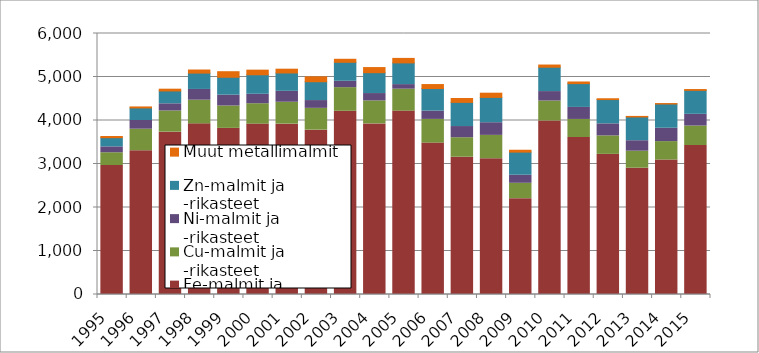
| Category | Fe-malmit ja -rikasteet | Cu-malmit ja -rikasteet | Ni-malmit ja -rikasteet | Zn-malmit ja -rikasteet | Muut metallimalmit |
|---|---|---|---|---|---|
| 1995.0 | 2964991 | 293676 | 134831 | 211074 | 27802 |
| 1996.0 | 3305768 | 494217 | 200610 | 288603 | 22806 |
| 1997.0 | 3732023 | 487477 | 163962 | 295485 | 40700 |
| 1998.0 | 3922531 | 544111 | 247276 | 375432 | 71235 |
| 1999.0 | 3818566 | 514879 | 249028 | 411447 | 127706 |
| 2000.0 | 3917135 | 468557 | 217154 | 448698 | 105879 |
| 2001.0 | 3916207 | 503460 | 250973 | 422274 | 86600 |
| 2002.0 | 3778578 | 500798 | 178968 | 433196 | 112407 |
| 2003.0 | 4212158 | 543488 | 146122 | 436345 | 69267 |
| 2004.0 | 3921507 | 528930 | 169170 | 479603 | 117553 |
| 2005.0 | 4215633 | 504658 | 104983 | 499024 | 103122 |
| 2006.0 | 3481019 | 544149 | 190233 | 520081 | 90806 |
| 2007.0 | 3156096 | 448119 | 256932 | 555569 | 88572 |
| 2008.0 | 3121303 | 536584 | 290914 | 582049 | 97004 |
| 2009.0 | 2204018.428 | 352369.847 | 185201.501 | 532036.35 | 42403 |
| 2010.0 | 3989432.193 | 458174.471 | 217164.181 | 559918.304 | 50387 |
| 2011.0 | 3608822 | 415365 | 276892 | 547405 | 36734 |
| 2012.0 | 3220998 | 424982 | 276587 | 558963 | 18559 |
| 2013.0 | 2903192 | 391822 | 240116 | 546121 | 12681 |
| 2014.0 | 3091631 | 423149 | 307179 | 557447 | 9536 |
| 2015.0 | 3425061 | 447546 | 269701 | 550344 | 18970 |